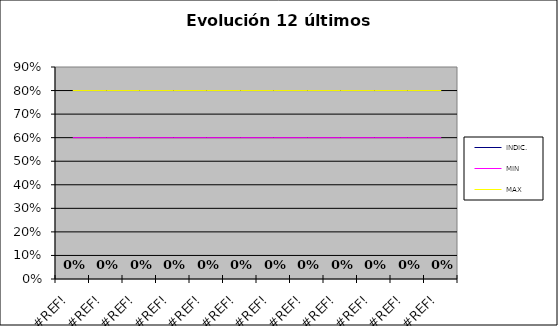
| Category | INDIC. | MIN | MAX |
|---|---|---|---|
| 0.0 | 0 | 0.6 | 0.8 |
| 0.0 | 0 | 0.6 | 0.8 |
| 0.0 | 0 | 0.6 | 0.8 |
| 0.0 | 0 | 0.6 | 0.8 |
| 0.0 | 0 | 0.6 | 0.8 |
| 0.0 | 0 | 0.6 | 0.8 |
| 0.0 | 0 | 0.6 | 0.8 |
| 0.0 | 0 | 0.6 | 0.8 |
| 0.0 | 0 | 0.6 | 0.8 |
| 0.0 | 0 | 0.6 | 0.8 |
| 0.0 | 0 | 0.6 | 0.8 |
| 0.0 | 0 | 0.6 | 0.8 |